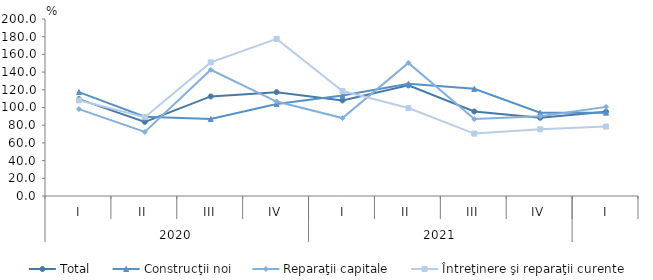
| Category | Total | Construcţii noi | Reparaţii capitale | Întreţinere şi reparaţii curente |
|---|---|---|---|---|
| 0 | 109.5 | 117.4 | 98.2 | 108.1 |
| 1 | 83.8 | 89.5 | 72.4 | 89 |
| 2 | 112.5 | 86.9 | 142.6 | 151 |
| 3 | 117.3 | 104 | 106.7 | 177.5 |
| 4 | 108 | 113.5 | 88.1 | 118.6 |
| 5 | 125 | 126.9 | 150.4 | 99.4 |
| 6 | 95.5 | 121.1 | 86.9 | 70.5 |
| 7 | 88.4 | 94.1 | 90.1 | 75.3 |
| 8 | 95.1 | 94.2 | 100.7 | 78.5 |